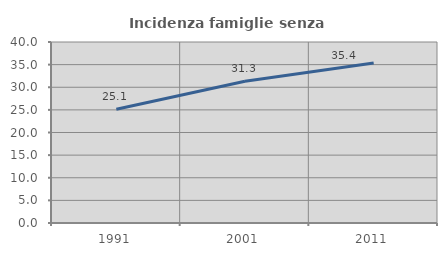
| Category | Incidenza famiglie senza nuclei |
|---|---|
| 1991.0 | 25.121 |
| 2001.0 | 31.33 |
| 2011.0 | 35.366 |